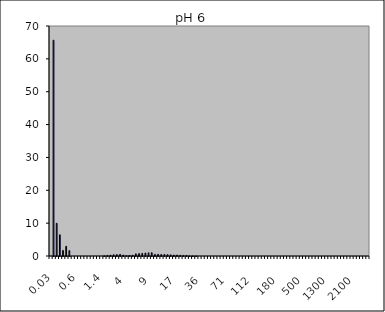
| Category | Maghemite pH 6 1Nb |
|---|---|
| 0.03 | 0 |
| 0.04 | 65.679 |
| 0.07 | 9.972 |
| 0.1 | 6.45 |
| 0.2 | 1.699 |
| 0.3 | 2.958 |
| 0.4 | 1.627 |
| 0.5 | 0 |
| 0.6 | 0 |
| 0.7 | 0 |
| 0.8 | 0 |
| 0.9 | 0 |
| 1.0 | 0 |
| 1.1 | 0 |
| 1.2 | 0 |
| 1.3 | 0 |
| 1.4 | 0 |
| 1.6 | 0.069 |
| 1.8 | 0.182 |
| 2.0 | 0.261 |
| 2.2 | 0.385 |
| 2.4 | 0.422 |
| 2.6 | 0.497 |
| 3.0 | 0.278 |
| 4.0 | 0.117 |
| 5.0 | 0.178 |
| 6.0 | 0.235 |
| 6.5 | 0.65 |
| 7.0 | 0.743 |
| 7.5 | 0.798 |
| 8.0 | 0.901 |
| 8.5 | 0.959 |
| 9.0 | 1.017 |
| 10.0 | 0.494 |
| 11.0 | 0.514 |
| 12.0 | 0.457 |
| 13.0 | 0.459 |
| 14.0 | 0.413 |
| 15.0 | 0.355 |
| 16.0 | 0.284 |
| 17.0 | 0.303 |
| 18.0 | 0.214 |
| 19.0 | 0.17 |
| 20.0 | 0.179 |
| 22.0 | 0.032 |
| 25.0 | 0.024 |
| 28.0 | 0.027 |
| 32.0 | 0 |
| 36.0 | 0 |
| 38.0 | 0 |
| 40.0 | 0 |
| 45.0 | 0 |
| 50.0 | 0 |
| 53.0 | 0 |
| 56.0 | 0 |
| 63.0 | 0 |
| 71.0 | 0 |
| 75.0 | 0 |
| 80.0 | 0 |
| 85.0 | 0 |
| 90.0 | 0 |
| 95.0 | 0 |
| 100.0 | 0 |
| 106.0 | 0 |
| 112.0 | 0 |
| 125.0 | 0 |
| 130.0 | 0 |
| 140.0 | 0 |
| 145.0 | 0 |
| 150.0 | 0 |
| 160.0 | 0 |
| 170.0 | 0 |
| 180.0 | 0 |
| 190.0 | 0 |
| 200.0 | 0 |
| 212.0 | 0 |
| 242.0 | 0 |
| 250.0 | 0 |
| 300.0 | 0 |
| 400.0 | 0 |
| 500.0 | 0 |
| 600.0 | 0 |
| 700.0 | 0 |
| 800.0 | 0 |
| 900.0 | 0 |
| 1000.0 | 0 |
| 1100.0 | 0 |
| 1200.0 | 0 |
| 1300.0 | 0 |
| 1400.0 | 0 |
| 1500.0 | 0 |
| 1600.0 | 0 |
| 1700.0 | 0 |
| 1800.0 | 0 |
| 1900.0 | 0 |
| 2000.0 | 0 |
| 2100.0 | 0 |
| 2200.0 | 0 |
| 2300.0 | 0 |
| 2400.0 | 0 |
| 2500.0 | 0 |